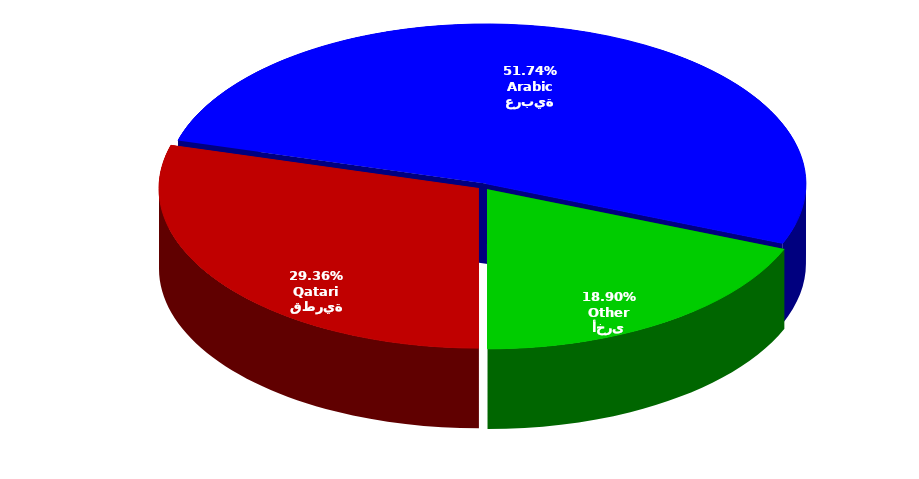
| Category | Series 0 |
|---|---|
| قطرية
Qatari | 121862 |
| عربية
Arabic | 214783 |
| أخرى
Other | 78439 |